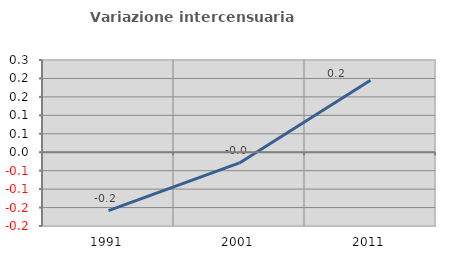
| Category | Variazione intercensuaria annua |
|---|---|
| 1991.0 | -0.158 |
| 2001.0 | -0.029 |
| 2011.0 | 0.195 |